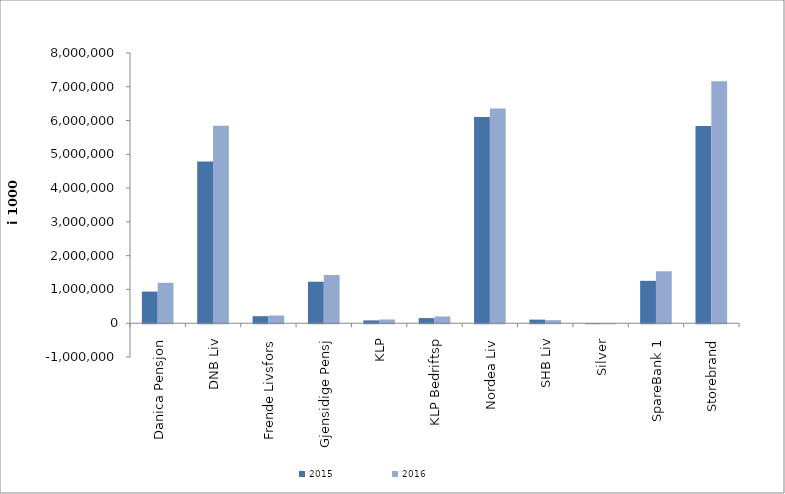
| Category | 2015 | 2016 |
|---|---|---|
| 0 | 936513.964 | 1195735.773 |
| 1 | 4785728 | 5845636 |
| 2 | 207725 | 226726 |
| 3 | 1228610.657 | 1428491.622 |
| 4 | 83502.852 | 110318.236 |
| 5 | 152462 | 199650 |
| 6 | 6105972.47 | 6359161.9 |
| 7 | 106482 | 90696 |
| 8 | 15.516 | -0.695 |
| 9 | 1254818.709 | 1535857.553 |
| 10 | 5838961.642 | 7164503.442 |